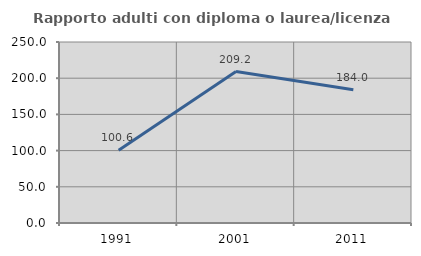
| Category | Rapporto adulti con diploma o laurea/licenza media  |
|---|---|
| 1991.0 | 100.615 |
| 2001.0 | 209.16 |
| 2011.0 | 183.992 |